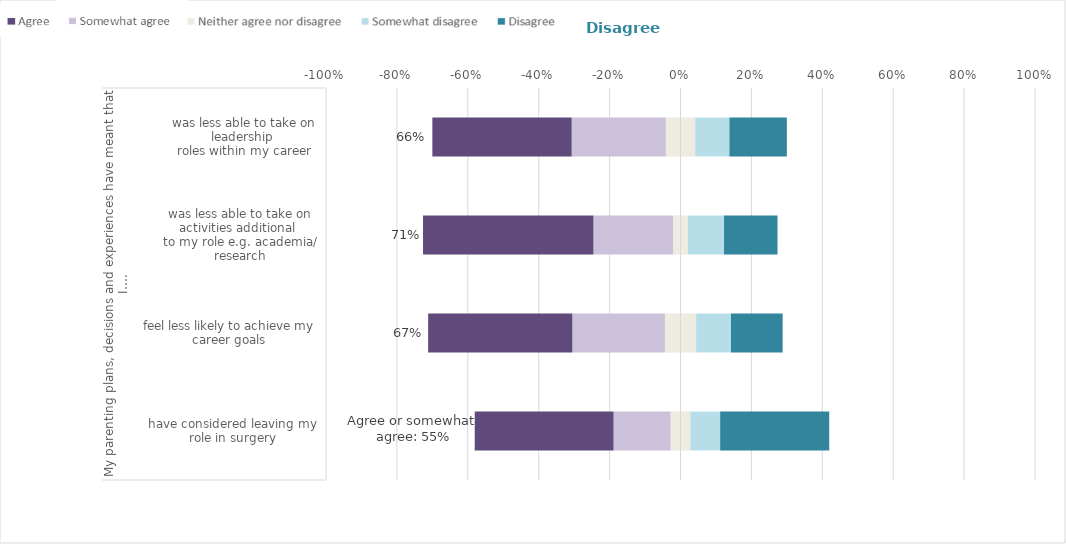
| Category | Neither agree nor disagree | Somewhat agree | Agree | Somewhat disagree | Disagree |
|---|---|---|---|---|---|
| 0 | 0.028 | -0.161 | -0.392 | 0.084 | 0.308 |
| 1 | 0.044 | -0.261 | -0.407 | 0.098 | 0.146 |
| 2 | 0.021 | -0.225 | -0.481 | 0.102 | 0.151 |
| 3 | 0.041 | -0.266 | -0.393 | 0.097 | 0.162 |